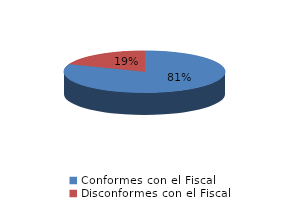
| Category | Series 0 |
|---|---|
| 0 | 1413 |
| 1 | 333 |